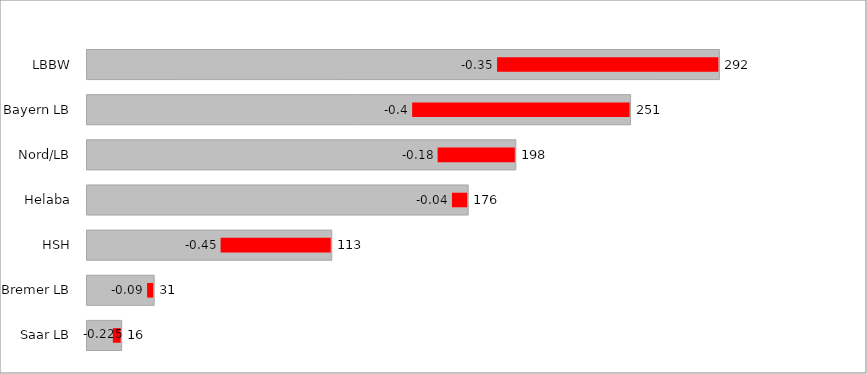
| Category | Bilanzsumme | PositionWerte |
|---|---|---|
| Saar LB | 16 | 12.4 |
| Bremer LB | 31 | 28.21 |
| HSH | 113 | 62.15 |
| Helaba | 176 | 168.96 |
| Nord/LB | 198 | 162.36 |
| Bayern LB | 251 | 150.6 |
| LBBW | 292 | 189.8 |